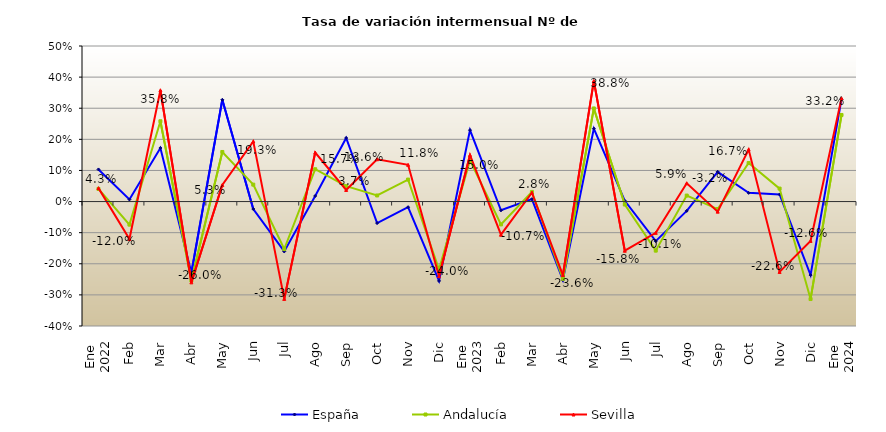
| Category | España | Andalucía | Sevilla |
|---|---|---|---|
| 0 | 0.103 | 0.041 | 0.043 |
| 1 | 0.007 | -0.074 | -0.12 |
| 2 | 0.172 | 0.258 | 0.358 |
| 3 | -0.229 | -0.254 | -0.26 |
| 4 | 0.327 | 0.159 | 0.053 |
| 5 | -0.024 | 0.054 | 0.193 |
| 6 | -0.16 | -0.153 | -0.313 |
| 7 | 0.018 | 0.104 | 0.157 |
| 8 | 0.204 | 0.049 | 0.037 |
| 9 | -0.069 | 0.02 | 0.136 |
| 10 | -0.018 | 0.071 | 0.118 |
| 11 | -0.255 | -0.218 | -0.24 |
| 12 | 0.23 | 0.133 | 0.15 |
| 13 | -0.028 | -0.073 | -0.107 |
| 14 | 0.008 | 0.031 | 0.028 |
| 15 | -0.252 | -0.248 | -0.236 |
| 16 | 0.235 | 0.299 | 0.388 |
| 17 | 0.002 | -0.01 | -0.158 |
| 18 | -0.127 | -0.158 | -0.101 |
| 19 | -0.03 | 0.019 | 0.059 |
| 20 | 0.096 | -0.024 | -0.032 |
| 21 | 0.028 | 0.124 | 0.167 |
| 22 | 0.023 | 0.042 | -0.226 |
| 23 | -0.236 | -0.313 | -0.126 |
| 24 | 0.329 | 0.278 | 0.332 |